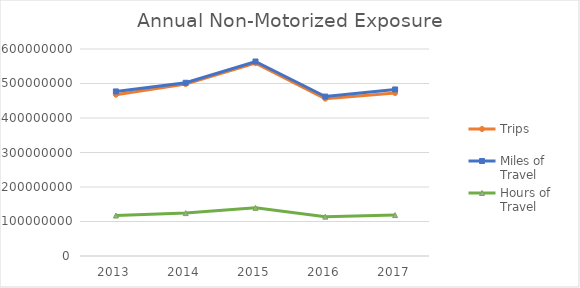
| Category | Trips | Miles of Travel | Hours of Travel |
|---|---|---|---|
| 2013 | 467559159.76 | 477008038.854 | 117272478.566 |
| 2014 | 498320486.985 | 502168403.02 | 124354891.4 |
| 2015 | 558934535.002 | 563753441.281 | 139532177.111 |
| 2016 | 456008892.436 | 462083046.298 | 114055857.752 |
| 2017 | 472158694.074 | 482707551.655 | 118528582.891 |